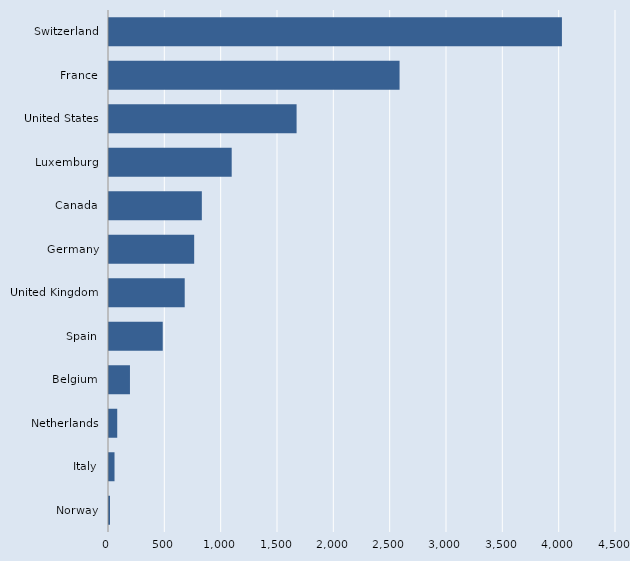
| Category | Series 0 |
|---|---|
| Norway | 9 |
| Italy | 49 |
| Netherlands | 73 |
| Belgium | 186 |
| Spain | 477 |
| United Kingdom | 672 |
| Germany | 756 |
| Canada | 824 |
| Luxemburg | 1089 |
| United States | 1665 |
| France | 2579 |
| Switzerland | 4020 |